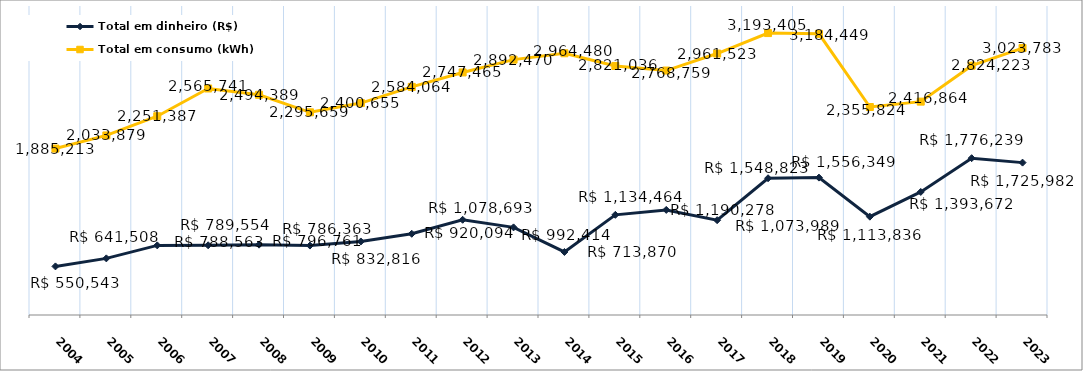
| Category | Total em dinheiro (R$) | Total em consumo (kWh) |
|---|---|---|
| 2004.0 | 550542.69 | 1885213 |
| 2005.0 | 641507.62 | 2033879 |
| 2006.0 | 788563.39 | 2251387 |
| 2007.0 | 789553.84 | 2565741 |
| 2008.0 | 796761.3 | 2494389 |
| 2009.0 | 786362.51 | 2295659 |
| 2010.0 | 832816.11 | 2400655 |
| 2011.0 | 920094.37 | 2584064 |
| 2012.0 | 1078693.45 | 2747465 |
| 2013.0 | 992413.73 | 2892470 |
| 2014.0 | 713870.2 | 2964480 |
| 2015.0 | 1134464.4 | 2821036 |
| 2016.0 | 1190277.91 | 2768759 |
| 2017.0 | 1073989.15 | 2961523 |
| 2018.0 | 1548822.87 | 3193405.37 |
| 2019.0 | 1556349 | 3184449 |
| 2020.0 | 1113835.77 | 2355824 |
| 2021.0 | 1393672.32 | 2416864 |
| 2022.0 | 1776239.04 | 2824223 |
| 2023.0 | 1725982.36 | 3023783 |